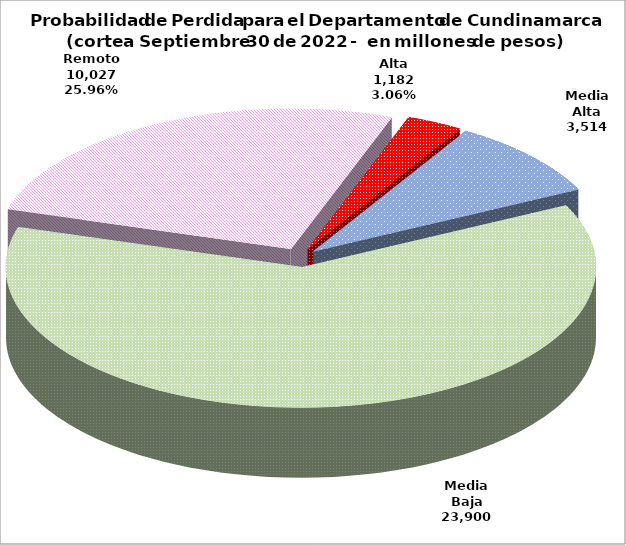
| Category | Series 0 |
|---|---|
| Alta | 1181.967 |
| Media Alta | 3514.001 |
| Media Baja | 23899.994 |
| Remoto | 10026.839 |